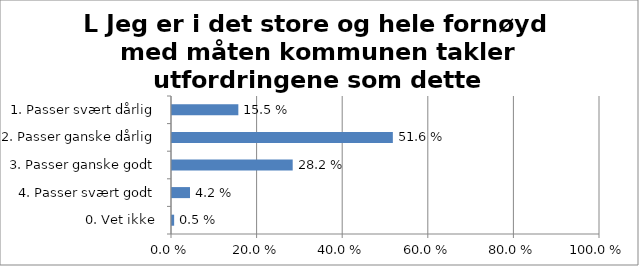
| Category | L Jeg er i det store og hele fornøyd med måten kommunen takler utfordringene som dette lokalsamfunnet står overfor |
|---|---|
| 1. Passer svært dårlig | 0.155 |
| 2. Passer ganske dårlig | 0.516 |
| 3. Passer ganske godt | 0.282 |
| 4. Passer svært godt | 0.042 |
| 0. Vet ikke | 0.005 |